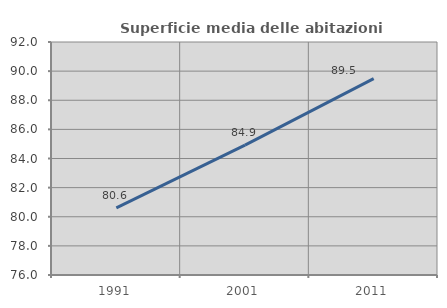
| Category | Superficie media delle abitazioni occupate |
|---|---|
| 1991.0 | 80.606 |
| 2001.0 | 84.915 |
| 2011.0 | 89.49 |